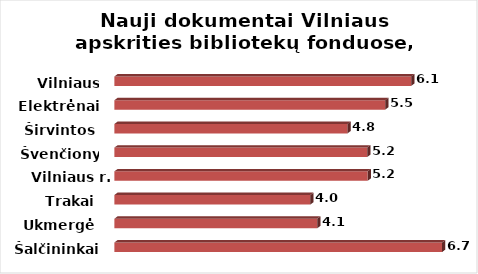
| Category | Series 0 |
|---|---|
| Šalčininkai | 6.69 |
| Ukmergė | 4.14 |
| Trakai | 4 |
| Vilniaus r. | 5.17 |
| Švenčionys | 5.16 |
| Širvintos | 4.76 |
| Elektrėnai | 5.53 |
| Vilniaus m. | 6.06 |